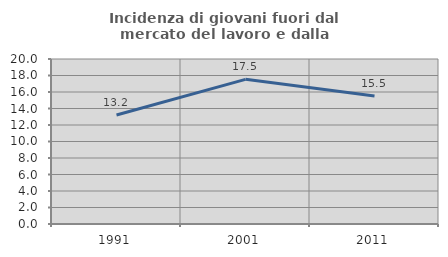
| Category | Incidenza di giovani fuori dal mercato del lavoro e dalla formazione  |
|---|---|
| 1991.0 | 13.204 |
| 2001.0 | 17.534 |
| 2011.0 | 15.504 |